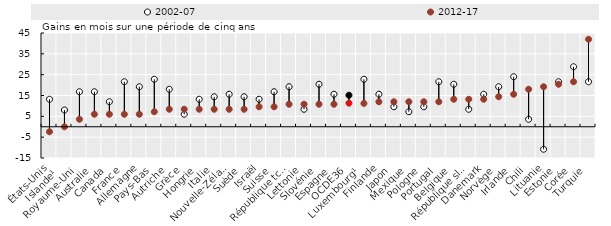
| Category | 2002-07 | 2012-17 |
|---|---|---|
| États-Unis | 13.2 | -2.4 |
| Islande¹  | 8.04 | 0 |
| Royaume-Uni | 16.8 | 3.6 |
| Australie | 16.8 | 6 |
| Canada | 12 | 6 |
| France | 21.6 | 6 |
| Allemagne | 19.2 | 6 |
| Pays-Bas | 22.8 | 7.2 |
| Autriche | 18 | 8.4 |
| Grèce | 6 | 8.4 |
| Hongrie | 13.2 | 8.4 |
| Italie | 14.4 | 8.4 |
| Nouvelle-Zélande | 15.6 | 8.4 |
| Suède | 14.4 | 8.4 |
| Israël | 13.2 | 9.6 |
| Suisse | 16.8 | 9.6 |
| République tchèque | 19.2 | 10.8 |
| Lettonie | 8.4 | 10.8 |
| Slovénie | 20.4 | 10.8 |
| Espagne | 15.6 | 10.8 |
| OCDE36 | 15.121 | 11.306 |
| Luxembourg¹  | 22.8 | 11.2 |
| Finlande | 15.6 | 12 |
| Japon | 9.6 | 12 |
| Mexique | 7.2 | 12 |
| Pologne | 9.6 | 12 |
| Portugal | 21.6 | 12 |
| Belgique | 20.4 | 13.2 |
| République slovaque | 8.4 | 13.2 |
| Danemark | 15.6 | 13.2 |
| Norvège | 19.2 | 14.4 |
| Irlande | 24 | 15.6 |
| Chili | 3.6 | 18 |
| Lituanie | -10.8 | 19.2 |
| Estonie | 21.6 | 20.4 |
| Corée | 28.8 | 21.6 |
| Turquie | 21.6 | 42 |